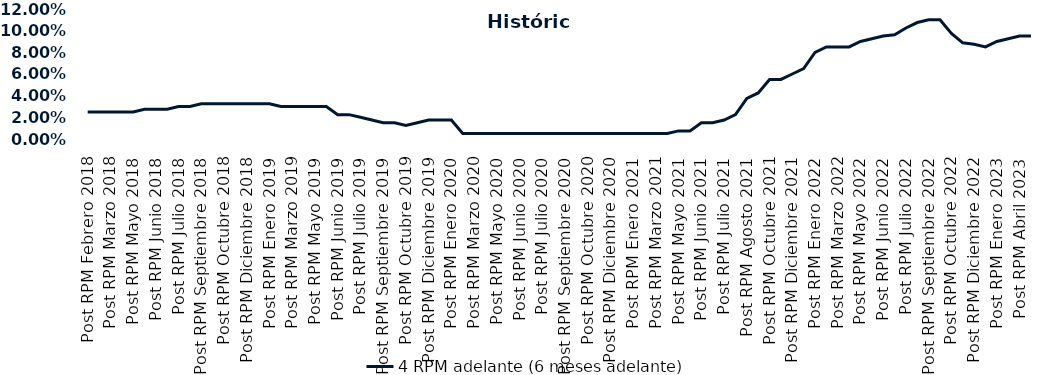
| Category | 4 RPM adelante (6 meses adelante) |
|---|---|
| Post RPM Febrero 2018 | 0.025 |
| Pre RPM Marzo 2018 | 0.025 |
| Post RPM Marzo 2018 | 0.025 |
| Pre RPM Mayo 2018 | 0.025 |
| Post RPM Mayo 2018 | 0.025 |
| Pre RPM Junio 2018 | 0.028 |
| Post RPM Junio 2018 | 0.028 |
| Pre RPM Julio 2018 | 0.028 |
| Post RPM Julio 2018 | 0.03 |
| Pre RPM Septiembre 2018 | 0.03 |
| Post RPM Septiembre 2018 | 0.032 |
| Pre RPM Octubre 2018 | 0.032 |
| Post RPM Octubre 2018 | 0.032 |
| Pre RPM Diciembre 2018 | 0.032 |
| Post RPM Diciembre 2018 | 0.032 |
| Pre RPM Enero 2019 | 0.032 |
| Post RPM Enero 2019 | 0.032 |
| Pre RPM Marzo 2019 | 0.03 |
| Post RPM Marzo 2019 | 0.03 |
| Pre RPM Mayo 2019 | 0.03 |
| Post RPM Mayo 2019 | 0.03 |
| Pre RPM Junio 2019 | 0.03 |
| Post RPM Junio 2019 | 0.022 |
| Pre RPM Julio 2019 | 0.022 |
| Post RPM Julio 2019 | 0.02 |
| Pre RPM Septiembre 2019 | 0.018 |
| Post RPM Septiembre 2019 | 0.015 |
| Pre RPM Octubre 2019 | 0.015 |
| Post RPM Octubre 2019 | 0.012 |
| Pre RPM Diciembre 2019 | 0.015 |
| Post RPM Diciembre 2019 | 0.018 |
| Pre RPM Enero 2020 | 0.018 |
| Post RPM Enero 2020 | 0.018 |
| Pre RPM Marzo 2020 | 0.005 |
| Post RPM Marzo 2020 | 0.005 |
| Pre RPM Mayo 2020 | 0.005 |
| Post RPM Mayo 2020 | 0.005 |
| Pre RPM Junio 2020 | 0.005 |
| Post RPM Junio 2020 | 0.005 |
| Pre RPM Julio 2020 | 0.005 |
| Post RPM Julio 2020 | 0.005 |
| Pre RPM Septiembre 2020 | 0.005 |
| Post RPM Septiembre 2020 | 0.005 |
| Pre RPM Octubre 2020 | 0.005 |
| Post RPM Octubre 2020 | 0.005 |
| Pre RPM Diciembre 2020 | 0.005 |
| Post RPM Diciembre 2020 | 0.005 |
| Pre RPM Enero 2021 | 0.005 |
| Post RPM Enero 2021 | 0.005 |
| Pre RPM Marzo 2021 | 0.005 |
| Post RPM Marzo 2021 | 0.005 |
| Pre RPM Mayo 2021 | 0.005 |
| Post RPM Mayo 2021 | 0.008 |
| Pre RPM Junio 2021 | 0.008 |
| Post RPM Junio 2021 | 0.015 |
| Pre RPM Julio 2021 | 0.015 |
| Post RPM Julio 2021 | 0.018 |
| Pre RPM Agosto 2021 | 0.022 |
| Post RPM Agosto 2021 | 0.038 |
| Pre RPM Octubre 2021 | 0.042 |
| Post RPM Octubre 2021 | 0.055 |
| Pre RPM Diciembre 2021 | 0.055 |
| Post RPM Diciembre 2021 | 0.06 |
| Pre RPM Enero 2022 | 0.065 |
| Post RPM Enero 2022 | 0.08 |
| Pre RPM Marzo 2022 | 0.085 |
| Post RPM Marzo 2022 | 0.085 |
| Pre RPM Mayo 2022 | 0.085 |
| Post RPM Mayo 2022 | 0.09 |
| Pre RPM Junio 2022 | 0.092 |
| Post RPM Junio 2022 | 0.095 |
| Pre RPM Julio 2022 | 0.096 |
| Post RPM Julio 2022 | 0.102 |
| Pre RPM Septiembre 2022 | 0.108 |
| Post RPM Septiembre 2022 | 0.11 |
| Pre RPM Octubre 2022 | 0.11 |
| Post RPM Octubre 2022 | 0.098 |
| Pre RPM Diciembre 2022 | 0.089 |
| Post RPM Diciembre 2022 | 0.088 |
| Pre RPM Enero 2023 | 0.085 |
| Post RPM Enero 2023 | 0.09 |
| Pre RPM Abril 2023 | 0.092 |
| Post RPM Abril 2023 | 0.095 |
| Pre RPM Mayo 2023 | 0.095 |